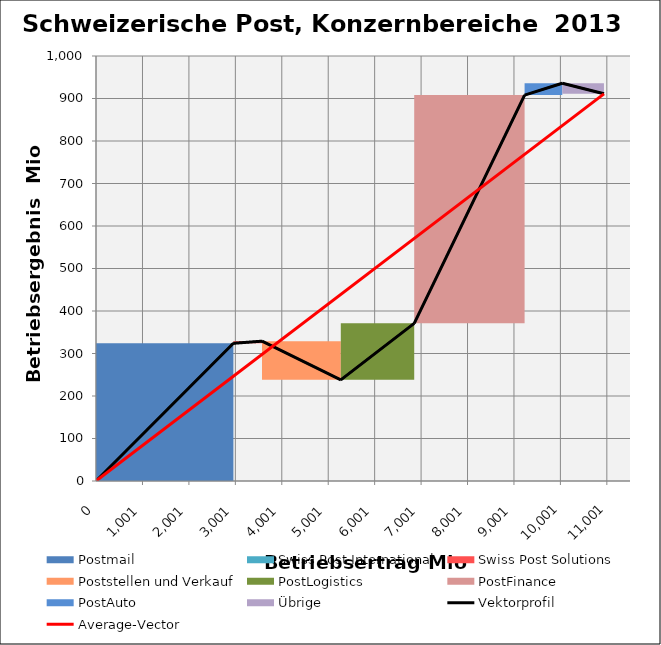
| Category | transparent | Postmail | Swiss Post International | Swiss Post Solutions | Poststellen und Verkauf | PostLogistics | PostFinance | PostAuto | Übrige | Border right & top |
|---|---|---|---|---|---|---|---|---|---|---|
| 0.0 | 0 | 324 | 0 | 0 | 0 | 0 | 0 | 0 | 0 | 0 |
| 2959.0 | 0 | 324 | 0 | 0 | 0 | 0 | 0 | 0 | 0 | 0 |
| 2959.0 | 324 | 0 | 0 | 0 | 0 | 0 | 0 | 0 | 0 | 0 |
| 2959.0 | 324 | 0 | 0 | 0 | 0 | 0 | 0 | 0 | 0 | 0 |
| 2959.0 | 324 | 0 | 0 | 5 | 0 | 0 | 0 | 0 | 0 | 0 |
| 3575.0 | 324 | 0 | 0 | 5 | 0 | 0 | 0 | 0 | 0 | 0 |
| 3575.0 | 329 | 0 | 0 | 0 | -91 | 0 | 0 | 0 | 0 | 0 |
| 5272.0 | 329 | 0 | 0 | 0 | -91 | 0 | 0 | 0 | 0 | 0 |
| 5272.0 | 238 | 0 | 0 | 0 | 0 | 133 | 0 | 0 | 0 | 0 |
| 6853.0 | 238 | 0 | 0 | 0 | 0 | 133 | 0 | 0 | 0 | 0 |
| 6853.0 | 371 | 0 | 0 | 0 | 0 | 0 | 537 | 0 | 0 | 0 |
| 9230.0 | 371 | 0 | 0 | 0 | 0 | 0 | 537 | 0 | 0 | 0 |
| 9230.0 | 908 | 0 | 0 | 0 | 0 | 0 | 0 | 28 | 0 | 0 |
| 10042.0 | 908 | 0 | 0 | 0 | 0 | 0 | 0 | 28 | 0 | 0 |
| 10042.0 | 936 | 0 | 0 | 0 | 0 | 0 | 0 | 0 | -25 | 0 |
| 10939.0 | 936 | 0 | 0 | 0 | 0 | 0 | 0 | 0 | -25 | 0 |
| 10939.0 | 911 | 0 | 0 | 0 | 0 | 0 | 0 | 0 | 0 | 0 |
| 10939.0 | 911 | 0 | 0 | 0 | 0 | 0 | 0 | 0 | 0 | 0 |
| 10939.0 | 911 | 0 | 0 | 0 | 0 | 0 | 0 | 0 | 0 | 0 |
| 10939.0 | 911 | 0 | 0 | 0 | 0 | 0 | 0 | 0 | 0 | 0 |
| 10939.0 | 911 | 0 | 0 | 0 | 0 | 0 | 0 | 0 | 0 | 0 |
| 11500.0 | 911 | 0 | 0 | 0 | 0 | 0 | 0 | 0 | 0 | 0 |
| 11500.0 | 911 | 0 | 0 | 0 | 0 | 0 | 0 | 0 | 0 | 0 |